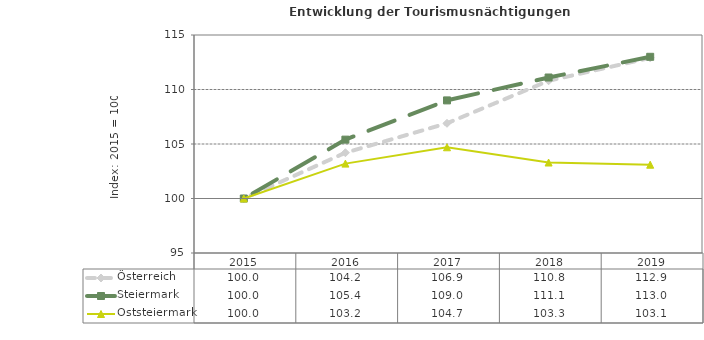
| Category | Österreich | Steiermark | Oststeiermark |
|---|---|---|---|
| 2019.0 | 112.9 | 113 | 103.1 |
| 2018.0 | 110.8 | 111.1 | 103.3 |
| 2017.0 | 106.9 | 109 | 104.7 |
| 2016.0 | 104.2 | 105.4 | 103.2 |
| 2015.0 | 100 | 100 | 100 |